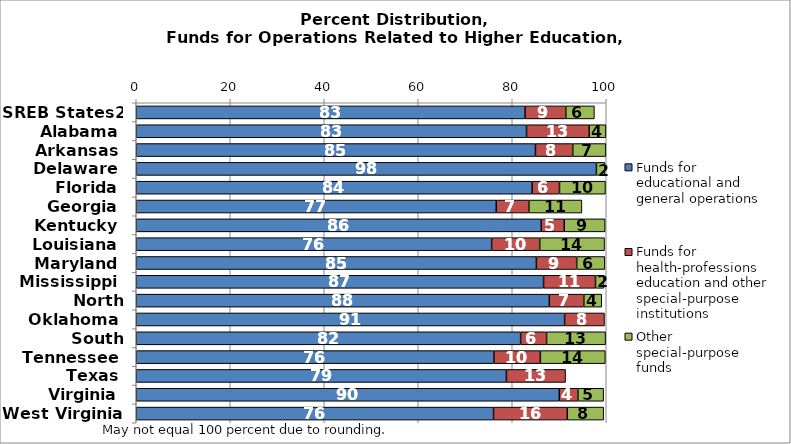
| Category | Funds for educational and general operations | Funds for health-professions education and other special-purpose institutions | Other special-purpose funds |
|---|---|---|---|
| SREB States2 | 82.723 | 8.679 | 6.077 |
| Alabama | 83.04 | 13.332 | 3.557 |
| Arkansas | 84.938 | 7.94 | 7.038 |
| Delaware | 97.91 | 0 | 1.802 |
| Florida | 84.237 | 5.819 | 9.78 |
| Georgia | 76.595 | 6.945 | 11.278 |
| Kentucky | 86.167 | 4.903 | 8.687 |
| Louisiana | 75.613 | 10.235 | 13.786 |
| Maryland | 85.13 | 8.58 | 5.985 |
| Mississippi | 86.665 | 11.047 | 1.803 |
| North Carolina | 87.895 | 7.341 | 3.803 |
| Oklahoma | 91.146 | 8.484 | 0 |
| South Carolina | 81.786 | 5.516 | 12.558 |
| Tennessee | 76.106 | 9.874 | 13.817 |
| Texas | 78.757 | 12.589 | 0 |
| Virginia | 90.016 | 3.96 | 5.468 |
| West Virginia | 76.019 | 15.695 | 7.74 |